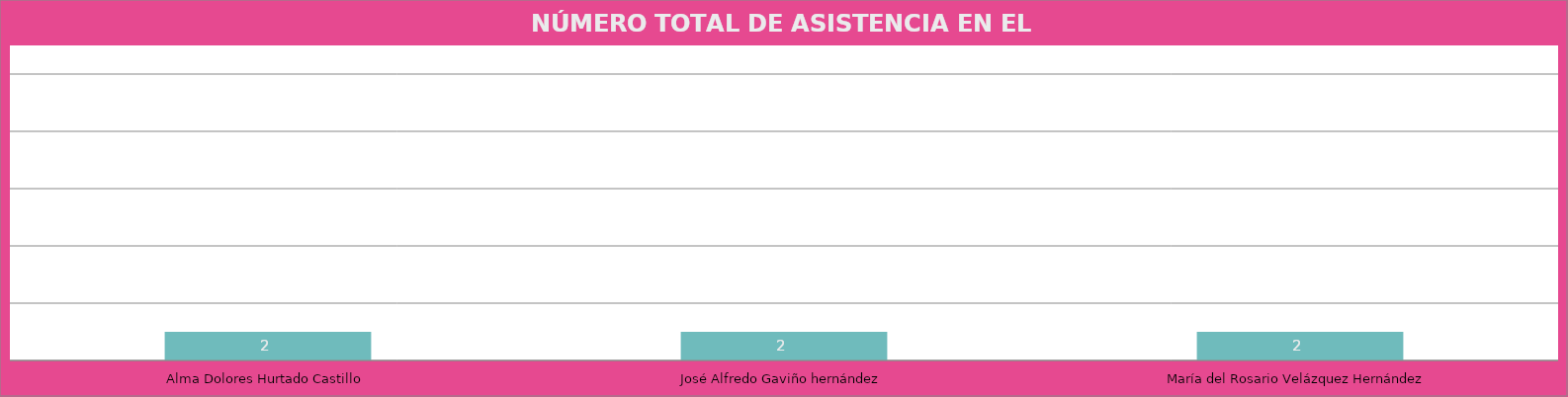
| Category | Alma Dolores Hurtado Castillo |
|---|---|
| Alma Dolores Hurtado Castillo | 2 |
| José Alfredo Gaviño hernández | 2 |
| María del Rosario Velázquez Hernández | 2 |